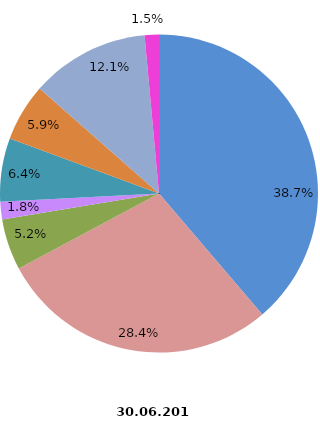
| Category | Anzahl Beschäftigte 2019 |
|---|---|
| Elektroinstallation | 5943 |
| Gas-, Wasser-, Heizungs- sowie Lüftungs- und Klimainstallation | 4360 |
| Sonstige Bauinstallation | 798 |
| Anbringen von Stuckaturen, Gipserei und Verputzerei | 275 |
| Bautischlerei und -schlosserei | 988 |
| Fußboden-, Fliesen- und Plattenlegerei, Tapeziererei | 901 |
| Malerei und Glaserei | 1851 |
| Sonstiger Ausbau a. n. g. | 222 |